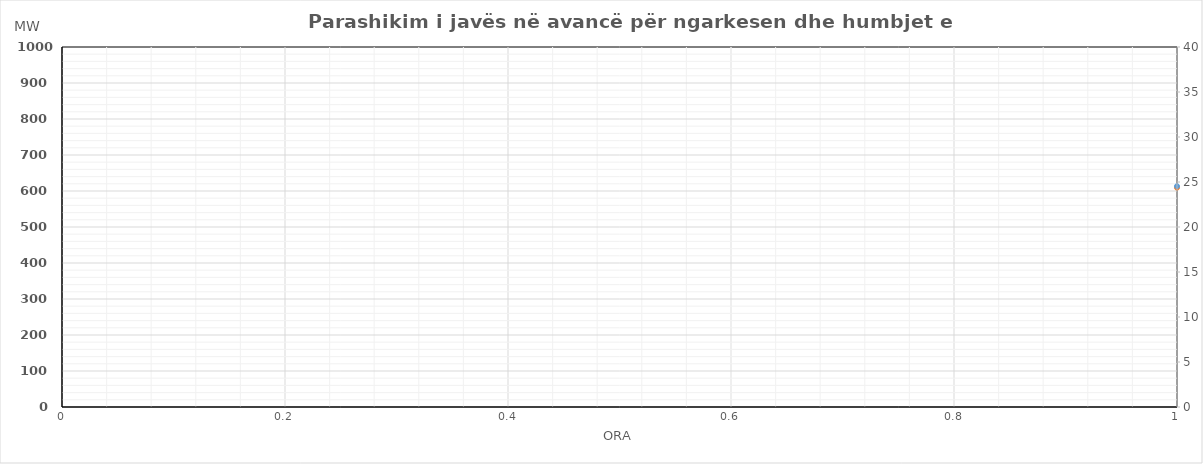
| Category | Ngarkesa (MWh) |
|---|---|
| 0 | 609.115 |
| 1 | 558.308 |
| 2 | 540.031 |
| 3 | 505.708 |
| 4 | 526.089 |
| 5 | 550.602 |
| 6 | 621.724 |
| 7 | 703.46 |
| 8 | 778.451 |
| 9 | 818.281 |
| 10 | 829.267 |
| 11 | 843.581 |
| 12 | 855.011 |
| 13 | 845.651 |
| 14 | 799.405 |
| 15 | 772.925 |
| 16 | 798.372 |
| 17 | 812.359 |
| 18 | 843.564 |
| 19 | 859.32 |
| 20 | 908.306 |
| 21 | 903.564 |
| 22 | 813.454 |
| 23 | 703.252 |
| 24 | 601 |
| 25 | 545.48 |
| 26 | 524.911 |
| 27 | 513.157 |
| 28 | 525.338 |
| 29 | 555.711 |
| 30 | 631.136 |
| 31 | 734.644 |
| 32 | 826.86 |
| 33 | 871.691 |
| 34 | 864.4 |
| 35 | 885.099 |
| 36 | 886.698 |
| 37 | 879.544 |
| 38 | 845.349 |
| 39 | 800.373 |
| 40 | 803.029 |
| 41 | 809.34 |
| 42 | 833.069 |
| 43 | 848.972 |
| 44 | 882.854 |
| 45 | 876.058 |
| 46 | 781.383 |
| 47 | 681.014 |
| 48 | 594.313 |
| 49 | 543.53 |
| 50 | 524.121 |
| 51 | 513.25 |
| 52 | 519.63 |
| 53 | 546.581 |
| 54 | 639.131 |
| 55 | 762.197 |
| 56 | 841.321 |
| 57 | 864.369 |
| 58 | 876.777 |
| 59 | 899.493 |
| 60 | 874.471 |
| 61 | 842.481 |
| 62 | 824.192 |
| 63 | 775.615 |
| 64 | 772.157 |
| 65 | 787.802 |
| 66 | 802.534 |
| 67 | 825.396 |
| 68 | 871.906 |
| 69 | 841.1 |
| 70 | 748.02 |
| 71 | 643.138 |
| 72 | 601 |
| 73 | 548.48 |
| 74 | 527.911 |
| 75 | 516.157 |
| 76 | 528.338 |
| 77 | 558.711 |
| 78 | 634.136 |
| 79 | 737.644 |
| 80 | 829.86 |
| 81 | 874.691 |
| 82 | 867.4 |
| 83 | 888.099 |
| 84 | 889.698 |
| 85 | 882.544 |
| 86 | 848.349 |
| 87 | 803.373 |
| 88 | 806.029 |
| 89 | 812.34 |
| 90 | 836.069 |
| 91 | 851.972 |
| 92 | 885.854 |
| 93 | 879.058 |
| 94 | 784.383 |
| 95 | 684.014 |
| 96 | 609.115 |
| 97 | 562.308 |
| 98 | 544.031 |
| 99 | 509.708 |
| 100 | 530.089 |
| 101 | 554.602 |
| 102 | 625.724 |
| 103 | 707.46 |
| 104 | 782.451 |
| 105 | 822.281 |
| 106 | 833.267 |
| 107 | 847.581 |
| 108 | 859.011 |
| 109 | 849.651 |
| 110 | 803.405 |
| 111 | 776.925 |
| 112 | 802.372 |
| 113 | 816.359 |
| 114 | 847.564 |
| 115 | 863.32 |
| 116 | 912.306 |
| 117 | 907.564 |
| 118 | 817.454 |
| 119 | 707.252 |
| 120 | 612.115 |
| 121 | 561.308 |
| 122 | 543.031 |
| 123 | 508.708 |
| 124 | 529.089 |
| 125 | 553.602 |
| 126 | 624.724 |
| 127 | 706.46 |
| 128 | 781.451 |
| 129 | 821.281 |
| 130 | 832.267 |
| 131 | 846.581 |
| 132 | 858.011 |
| 133 | 848.651 |
| 134 | 802.405 |
| 135 | 775.925 |
| 136 | 801.372 |
| 137 | 815.359 |
| 138 | 846.564 |
| 139 | 862.32 |
| 140 | 911.306 |
| 141 | 906.564 |
| 142 | 816.454 |
| 143 | 706.252 |
| 144 | 601 |
| 145 | 552.48 |
| 146 | 531.911 |
| 147 | 520.157 |
| 148 | 532.338 |
| 149 | 562.711 |
| 150 | 638.136 |
| 151 | 741.644 |
| 152 | 833.86 |
| 153 | 878.691 |
| 154 | 871.4 |
| 155 | 892.099 |
| 156 | 893.698 |
| 157 | 886.544 |
| 158 | 852.349 |
| 159 | 807.373 |
| 160 | 810.029 |
| 161 | 816.34 |
| 162 | 840.069 |
| 163 | 855.972 |
| 164 | 889.854 |
| 165 | 883.058 |
| 166 | 788.383 |
| 167 | 688.014 |